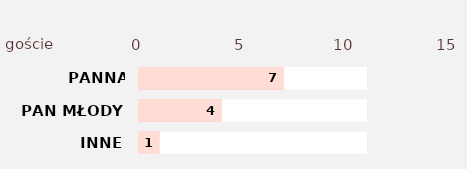
| Category | Series 2 | Series 3 | Series 1 | Series 0 |
|---|---|---|---|---|
| INNE | 11 | 1 | 11 | 1 |
| PAN MŁODY | 11 | 4 | 11 | 4 |
| PANNA MŁODA | 11 | 7 | 11 | 7 |